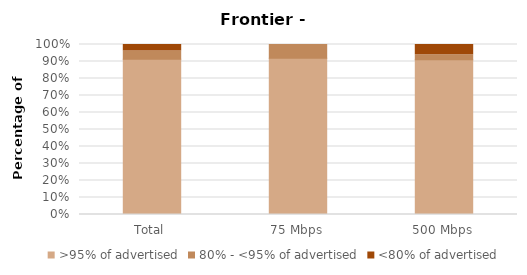
| Category | >95% of advertised | 80% - <95% of advertised | <80% of advertised |
|---|---|---|---|
| Total | 0.913 | 0.048 | 0.038 |
| 75 Mbps | 0.919 | 0.081 | 0 |
| 500 Mbps | 0.91 | 0.03 | 0.06 |